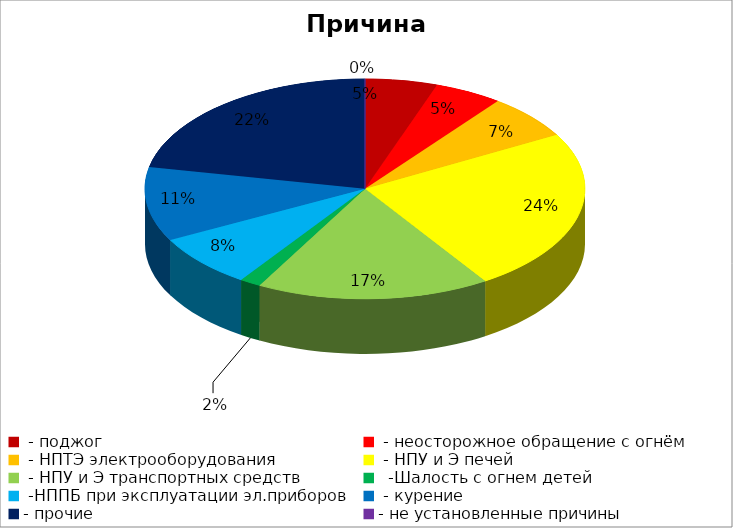
| Category | Причина пожара |
|---|---|
|  - поджог | 17 |
|  - неосторожное обращение с огнём | 16 |
|  - НПТЭ электрооборудования | 21 |
|  - НПУ и Э печей | 77 |
|  - НПУ и Э транспортных средств | 55 |
|   -Шалость с огнем детей | 5 |
|  -НППБ при эксплуатации эл.приборов | 25 |
|  - курение | 35 |
| - прочие | 70 |
| - не установленные причины | 0 |